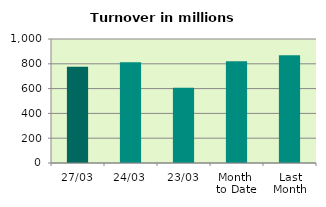
| Category | Series 0 |
|---|---|
| 27/03 | 776.437 |
| 24/03 | 813.263 |
| 23/03 | 607.464 |
| Month 
to Date | 820.356 |
| Last
Month | 868.35 |